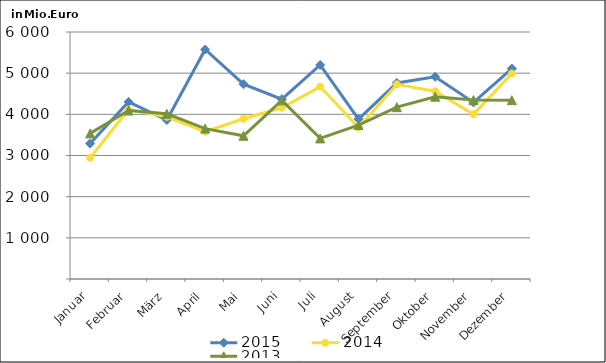
| Category | 2015 | 2014 | 2013 |
|---|---|---|---|
| Januar | 3291.226 | 2945.073 | 3537.058 |
| Februar | 4301.816 | 4114.543 | 4092.626 |
| März | 3860.633 | 3938.725 | 4012.941 |
| April | 5575.151 | 3576.692 | 3652.922 |
| Mai | 4731.962 | 3893.423 | 3479.447 |
| Juni | 4368.247 | 4160.188 | 4339.111 |
| Juli | 5199.348 | 4674.445 | 3415.428 |
| August | 3883.82 | 3678.421 | 3739.547 |
| September | 4763.262 | 4729.77 | 4174.685 |
| Oktober | 4911.831 | 4559.697 | 4428.827 |
| November | 4288.226 | 4002.537 | 4345.599 |
| Dezember | 5111.414 | 4991.049 | 4343.707 |